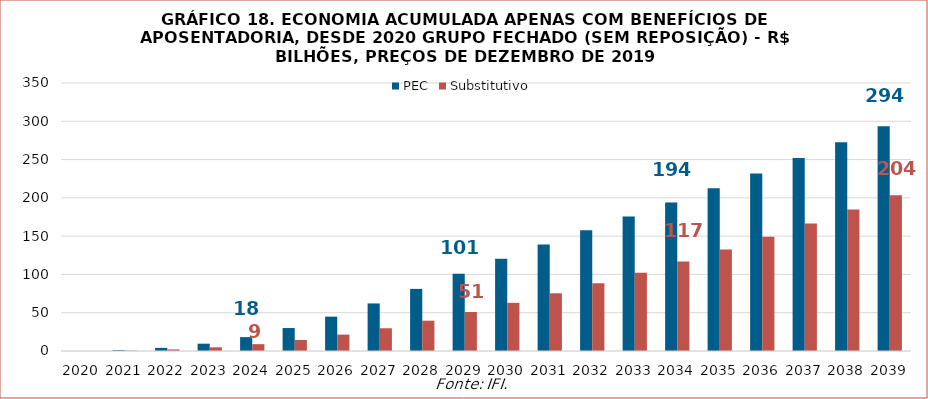
| Category | PEC | Substitutivo |
|---|---|---|
| 2020.0 | 250502811.852 | 142934873.66 |
| 2021.0 | 1424360653.49 | 772293838.26 |
| 2022.0 | 4401744968.104 | 2358010690.53 |
| 2023.0 | 9872690680.521 | 5104613315.389 |
| 2024.0 | 18405075670.719 | 9210007165.101 |
| 2025.0 | 30289483906.769 | 14725452232.23 |
| 2026.0 | 45183991076.285 | 21685459545.594 |
| 2027.0 | 62418638225.451 | 29986512993.391 |
| 2028.0 | 81427711164.694 | 39876002622.962 |
| 2029.0 | 101200015448.479 | 51204795674.445 |
| 2030.0 | 120650872122.751 | 63208364960.406 |
| 2031.0 | 139514898439.522 | 75671899495.798 |
| 2032.0 | 157840234988.374 | 88695173871.56 |
| 2033.0 | 175982190471.085 | 102501141314.108 |
| 2034.0 | 194242525353.353 | 117260388734.587 |
| 2035.0 | 212692712460.308 | 133003306059.42 |
| 2036.0 | 231984448248.459 | 149615902122.588 |
| 2037.0 | 252237599544.894 | 166970027882.764 |
| 2038.0 | 272919904780.842 | 185012182675.746 |
| 2039.0 | 293789345311.2 | 203646181846.732 |